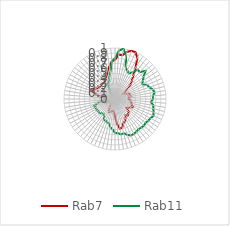
| Category | Rab7 | Rab11 |
|---|---|---|
| 0.0 | 0.763 | 0.797 |
| 0.10913 | 0.874 | 0.952 |
| 0.21825 | 0.868 | 1 |
| 0.32738 | 0.953 | 0.882 |
| 0.43651 | 0.998 | 0.648 |
| 0.54563 | 1 | 0.606 |
| 0.65476 | 0.919 | 0.568 |
| 0.76389 | 0.737 | 0.626 |
| 0.87302 | 0.586 | 0.729 |
| 0.98214 | 0.488 | 0.717 |
| 1.09127 | 0.413 | 0.816 |
| 1.2004 | 0.274 | 0.709 |
| 1.30952 | 0.189 | 0.651 |
| 1.41865 | 0.214 | 0.61 |
| 1.52778 | 0.264 | 0.683 |
| 1.6369 | 0.303 | 0.713 |
| 1.74603 | 0.274 | 0.762 |
| 1.85516 | 0.315 | 0.785 |
| 1.96429 | 0.27 | 0.748 |
| 2.07341 | 0.263 | 0.747 |
| 2.18254 | 0.304 | 0.708 |
| 2.29167 | 0.311 | 0.764 |
| 2.40079 | 0.339 | 0.773 |
| 2.50992 | 0.343 | 0.8 |
| 2.61905 | 0.385 | 0.826 |
| 2.72817 | 0.35 | 0.792 |
| 2.8373 | 0.316 | 0.778 |
| 2.94643 | 0.283 | 0.759 |
| 3.05556 | 0.365 | 0.771 |
| 3.16468 | 0.38 | 0.761 |
| 3.27381 | 0.413 | 0.749 |
| 3.38294 | 0.379 | 0.766 |
| 3.49206 | 0.436 | 0.776 |
| 3.60119 | 0.475 | 0.779 |
| 3.71032 | 0.503 | 0.744 |
| 3.81944 | 0.578 | 0.692 |
| 3.92857 | 0.589 | 0.704 |
| 4.0377 | 0.495 | 0.669 |
| 4.14683 | 0.337 | 0.664 |
| 4.25595 | 0.254 | 0.596 |
| 4.36508 | 0.234 | 0.558 |
| 4.47421 | 0.243 | 0.491 |
| 4.58333 | 0.269 | 0.481 |
| 4.69246 | 0.279 | 0.463 |
| 4.80159 | 0.25 | 0.459 |
| 4.91071 | 0.188 | 0.388 |
| 5.01984 | 0.128 | 0.367 |
| 5.12897 | 0.104 | 0.378 |
| 5.2381 | 0.062 | 0.412 |
| 5.34722 | 0 | 0.401 |
| 5.45635 | 0.068 | 0.411 |
| 5.56548 | 0.105 | 0.426 |
| 5.6746 | 0.181 | 0.411 |
| 5.78373 | 0.199 | 0.44 |
| 5.89286 | 0.231 | 0.357 |
| 6.00198 | 0.159 | 0.293 |
| 6.11111 | 0.084 | 0.175 |
| 6.22024 | 0.104 | 0.099 |
| 6.32937 | 0.163 | 0.089 |
| 6.43849 | 0.297 | 0.064 |
| 6.54762 | 0.385 | 0.07 |
| 6.65675 | 0.48 | 0.017 |
| 6.76587 | 0.484 | 0 |
| 6.875 | 0.431 | 0.013 |
| 6.98413 | 0.391 | 0.011 |
| 7.09325 | 0.378 | 0.038 |
| 7.20238 | 0.376 | 0.063 |
| 7.31151 | 0.392 | 0.077 |
| 7.42063 | 0.387 | 0.132 |
| 7.52976 | 0.392 | 0.171 |
| 7.63889 | 0.428 | 0.251 |
| 7.74802 | 0.451 | 0.334 |
| 7.85714 | 0.495 | 0.38 |
| 7.96627 | 0.573 | 0.454 |
| 8.0754 | 0.657 | 0.54 |
| 8.18452 | 0.743 | 0.744 |